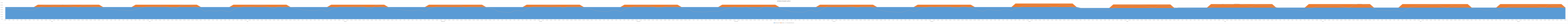
| Category | Forecasted Demand |
|---|---|
| 0 | 45.476 |
| 1 | 46.159 |
| 2 | 43.203 |
| 3 | 41.611 |
| 4 | 39.451 |
| 5 | 39.337 |
| 6 | 38.882 |
| 7 | 39.11 |
| 8 | 46.613 |
| 9 | 54.742 |
| 10 | 59.631 |
| 11 | 60.54 |
| 12 | 55.879 |
| 13 | 58.721 |
| 14 | 61.45 |
| 15 | 60.54 |
| 16 | 57.698 |
| 17 | 53.151 |
| 18 | 50.536 |
| 19 | 58.949 |
| 20 | 55.652 |
| 21 | 56.561 |
| 22 | 53.605 |
| 23 | 51.729 |
| 24 | 47.523 |
| 25 | 44.345 |
| 26 | 42.203 |
| 27 | 40.382 |
| 28 | 38.775 |
| 29 | 38.668 |
| 30 | 36.365 |
| 31 | 36.794 |
| 32 | 41.4 |
| 33 | 45.363 |
| 34 | 51.147 |
| 35 | 53.289 |
| 36 | 53.396 |
| 37 | 54.36 |
| 38 | 55.753 |
| 39 | 55.217 |
| 40 | 52.432 |
| 41 | 47.023 |
| 42 | 45.952 |
| 43 | 57.038 |
| 44 | 60.68 |
| 45 | 60.573 |
| 46 | 56.449 |
| 47 | 51.629 |
| 48 | 43.595 |
| 49 | 33.644 |
| 50 | 36.168 |
| 51 | 35.011 |
| 52 | 34.38 |
| 53 | 37.114 |
| 54 | 34.485 |
| 55 | 30.806 |
| 56 | 40.426 |
| 57 | 48.101 |
| 58 | 51.15 |
| 59 | 55.566 |
| 60 | 54.304 |
| 61 | 55.355 |
| 62 | 58.93 |
| 63 | 57.773 |
| 64 | 56.196 |
| 65 | 49.888 |
| 66 | 45.262 |
| 67 | 54.514 |
| 68 | 50.729 |
| 69 | 53.989 |
| 70 | 51.15 |
| 71 | 46.681 |
| 72 | 43.107 |
| 73 | 39.485 |
| 74 | 38.834 |
| 75 | 36.665 |
| 76 | 36.339 |
| 77 | 39.377 |
| 78 | 39.485 |
| 79 | 32.434 |
| 80 | 41.221 |
| 81 | 48.38 |
| 82 | 52.285 |
| 83 | 52.177 |
| 84 | 53.153 |
| 85 | 53.261 |
| 86 | 55.539 |
| 87 | 54.997 |
| 88 | 53.261 |
| 89 | 47.729 |
| 90 | 46.102 |
| 91 | 59.77 |
| 92 | 53.912 |
| 93 | 52.611 |
| 94 | 47.187 |
| 95 | 44.258 |
| 96 | 42.522 |
| 97 | 39.953 |
| 98 | 38.486 |
| 99 | 36.664 |
| 100 | 35.579 |
| 101 | 38.942 |
| 102 | 39.05 |
| 103 | 32.867 |
| 104 | 43.498 |
| 105 | 49.789 |
| 106 | 54.128 |
| 107 | 57.165 |
| 108 | 55.647 |
| 109 | 57.816 |
| 110 | 58.25 |
| 111 | 57.382 |
| 112 | 56.948 |
| 113 | 50.874 |
| 114 | 53.043 |
| 115 | 55.755 |
| 116 | 55.538 |
| 117 | 54.779 |
| 118 | 50.44 |
| 119 | 45.776 |
| 120 | 42.847 |
| 121 | 32.434 |
| 122 | 30.698 |
| 123 | 29.071 |
| 124 | 28.203 |
| 125 | 36.122 |
| 126 | 36.339 |
| 127 | 34.169 |
| 128 | 42.522 |
| 129 | 51.092 |
| 130 | 53.478 |
| 131 | 54.346 |
| 132 | 54.563 |
| 133 | 56.841 |
| 134 | 57.6 |
| 135 | 55.973 |
| 136 | 54.346 |
| 137 | 47.403 |
| 138 | 54.454 |
| 139 | 55.539 |
| 140 | 55.214 |
| 141 | 53.478 |
| 142 | 43.824 |
| 143 | 44.8 |
| 144 | 41.654 |
| 145 | 35.796 |
| 146 | 33.952 |
| 147 | 32.758 |
| 148 | 32.542 |
| 149 | 37.64 |
| 150 | 37.965 |
| 151 | 31.674 |
| 152 | 41.111 |
| 153 | 48.487 |
| 154 | 51.633 |
| 155 | 56.08 |
| 156 | 54.67 |
| 157 | 55.429 |
| 158 | 57.49 |
| 159 | 53.368 |
| 160 | 49.029 |
| 161 | 50.005 |
| 162 | 52.934 |
| 163 | 56.731 |
| 164 | 55.646 |
| 165 | 52.717 |
| 166 | 46.1 |
| 167 | 42.629 |
| 168 | 39.809 |
| 169 | 31.893 |
| 170 | 31.351 |
| 171 | 30.483 |
| 172 | 30.808 |
| 173 | 33.52 |
| 174 | 33.954 |
| 175 | 32.87 |
| 176 | 37.86 |
| 177 | 44.585 |
| 178 | 47.623 |
| 179 | 52.179 |
| 180 | 50.226 |
| 181 | 50.335 |
| 182 | 52.179 |
| 183 | 45.453 |
| 184 | 43.609 |
| 185 | 40.138 |
| 186 | 51.311 |
| 187 | 52.83 |
| 188 | 50.769 |
| 189 | 48.057 |
| 190 | 44.585 |
| 191 | 39.812 |
| 192 | 37.643 |
| 193 | 31.511 |
| 194 | 30.518 |
| 195 | 29.774 |
| 196 | 29.526 |
| 197 | 35.667 |
| 198 | 38.706 |
| 199 | 31.014 |
| 200 | 36.721 |
| 201 | 46.584 |
| 202 | 56.756 |
| 203 | 59.734 |
| 204 | 58.555 |
| 205 | 59.238 |
| 206 | 60.23 |
| 207 | 55.516 |
| 208 | 53.531 |
| 209 | 49.251 |
| 210 | 52.6 |
| 211 | 55.64 |
| 212 | 53.903 |
| 213 | 50.181 |
| 214 | 41.125 |
| 215 | 37.341 |
| 216 | 34.116 |
| 217 | 31.538 |
| 218 | 30.893 |
| 219 | 29.474 |
| 220 | 29.345 |
| 221 | 33.989 |
| 222 | 39.406 |
| 223 | 32.054 |
| 224 | 37.6 |
| 225 | 46.114 |
| 226 | 50.241 |
| 227 | 53.079 |
| 228 | 51.273 |
| 229 | 52.305 |
| 230 | 55.53 |
| 231 | 54.24 |
| 232 | 52.563 |
| 233 | 47.597 |
| 234 | 46.952 |
| 235 | 55.272 |
| 236 | 52.047 |
| 237 | 47.404 |
| 238 | 41.922 |
| 239 | 37.02 |
| 240 | 33.537 |
| 241 | 40.778 |
| 242 | 39.458 |
| 243 | 37.874 |
| 244 | 37.347 |
| 245 | 41.503 |
| 246 | 43.087 |
| 247 | 36.489 |
| 248 | 45.66 |
| 249 | 48.564 |
| 250 | 57.999 |
| 251 | 60.507 |
| 252 | 60.111 |
| 253 | 60.111 |
| 254 | 63.08 |
| 255 | 61.76 |
| 256 | 61.364 |
| 257 | 52.985 |
| 258 | 51.929 |
| 259 | 61.694 |
| 260 | 61.035 |
| 261 | 58.395 |
| 262 | 52.919 |
| 263 | 47.112 |
| 264 | 42.823 |
| 265 | 44.204 |
| 266 | 42.815 |
| 267 | 41.195 |
| 268 | 39.575 |
| 269 | 39.922 |
| 270 | 39.691 |
| 271 | 38.071 |
| 272 | 46.287 |
| 273 | 53.693 |
| 274 | 58.437 |
| 275 | 59.016 |
| 276 | 57.627 |
| 277 | 58.437 |
| 278 | 60.52 |
| 279 | 59.479 |
| 280 | 56.007 |
| 281 | 51.841 |
| 282 | 47.328 |
| 283 | 57.396 |
| 284 | 57.627 |
| 285 | 57.164 |
| 286 | 53.346 |
| 287 | 49.758 |
| 288 | 46.287 |
| 289 | 48.953 |
| 290 | 45.818 |
| 291 | 44.13 |
| 292 | 41.839 |
| 293 | 41.718 |
| 294 | 41.236 |
| 295 | 41.477 |
| 296 | 49.435 |
| 297 | 58.056 |
| 298 | 63.241 |
| 299 | 64.205 |
| 300 | 59.262 |
| 301 | 62.276 |
| 302 | 65.17 |
| 303 | 64.205 |
| 304 | 61.191 |
| 305 | 56.368 |
| 306 | 53.595 |
| 307 | 62.517 |
| 308 | 59.021 |
| 309 | 59.985 |
| 310 | 56.85 |
| 311 | 54.861 |
| 312 | 49.766 |
| 313 | 47.027 |
| 314 | 44.755 |
| 315 | 42.824 |
| 316 | 41.12 |
| 317 | 41.007 |
| 318 | 38.565 |
| 319 | 39.019 |
| 320 | 43.903 |
| 321 | 48.106 |
| 322 | 54.24 |
| 323 | 56.512 |
| 324 | 56.626 |
| 325 | 57.648 |
| 326 | 59.125 |
| 327 | 58.557 |
| 328 | 55.603 |
| 329 | 49.867 |
| 330 | 48.731 |
| 331 | 60.488 |
| 332 | 64.35 |
| 333 | 64.236 |
| 334 | 59.863 |
| 335 | 54.751 |
| 336 | 44.903 |
| 337 | 35.682 |
| 338 | 38.359 |
| 339 | 37.132 |
| 340 | 36.463 |
| 341 | 39.362 |
| 342 | 36.574 |
| 343 | 32.672 |
| 344 | 42.875 |
| 345 | 51.015 |
| 346 | 54.248 |
| 347 | 58.932 |
| 348 | 57.594 |
| 349 | 58.709 |
| 350 | 62.5 |
| 351 | 61.273 |
| 352 | 59.601 |
| 353 | 52.91 |
| 354 | 48.004 |
| 355 | 57.817 |
| 356 | 53.802 |
| 357 | 57.259 |
| 358 | 54.248 |
| 359 | 49.509 |
| 360 | 46.362 |
| 361 | 41.87 |
| 362 | 41.18 |
| 363 | 38.879 |
| 364 | 38.534 |
| 365 | 41.755 |
| 366 | 41.87 |
| 367 | 34.393 |
| 368 | 43.71 |
| 369 | 51.302 |
| 370 | 55.443 |
| 371 | 55.328 |
| 372 | 56.363 |
| 373 | 56.478 |
| 374 | 58.894 |
| 375 | 58.319 |
| 376 | 56.478 |
| 377 | 50.612 |
| 378 | 48.887 |
| 379 | 63.38 |
| 380 | 57.169 |
| 381 | 55.788 |
| 382 | 50.037 |
| 383 | 46.931 |